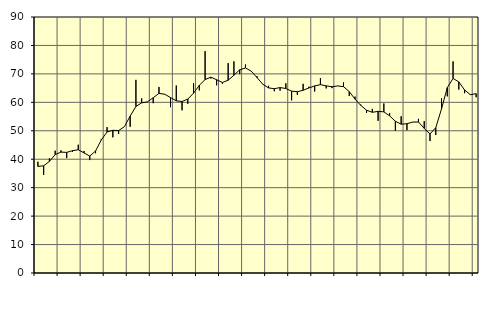
| Category | Piggar | Series 1 |
|---|---|---|
| nan | 39.1 | 37.46 |
| 1.0 | 34.5 | 37.68 |
| 1.0 | 40.3 | 39.23 |
| 1.0 | 43 | 41.63 |
| nan | 43.1 | 42.5 |
| 2.0 | 40.4 | 42.41 |
| 2.0 | 42.6 | 43 |
| 2.0 | 45.1 | 43.33 |
| nan | 42.9 | 42.22 |
| 3.0 | 39.7 | 41.11 |
| 3.0 | 42.1 | 42.87 |
| 3.0 | 47.1 | 46.78 |
| nan | 51.3 | 49.59 |
| 4.0 | 47.7 | 50.17 |
| 4.0 | 48.9 | 50.07 |
| 4.0 | 51.4 | 51.43 |
| nan | 51.4 | 55.16 |
| 5.0 | 67.9 | 58.56 |
| 5.0 | 61.4 | 59.81 |
| 5.0 | 60.1 | 60.16 |
| nan | 59.7 | 61.62 |
| 6.0 | 65.4 | 63.15 |
| 6.0 | 62.9 | 62.85 |
| 6.0 | 58.3 | 61.69 |
| nan | 65.9 | 60.53 |
| 7.0 | 57.2 | 60.29 |
| 7.0 | 59.5 | 61.15 |
| 7.0 | 66.7 | 63.23 |
| nan | 64.2 | 66.01 |
| 8.0 | 78 | 67.99 |
| 8.0 | 68.4 | 68.85 |
| 8.0 | 66 | 67.95 |
| nan | 66.5 | 66.98 |
| 9.0 | 73.8 | 67.78 |
| 9.0 | 74.4 | 69.53 |
| 9.0 | 69.9 | 71.44 |
| nan | 73.3 | 72.08 |
| 10.0 | 71 | 70.98 |
| 10.0 | 69.2 | 68.7 |
| 10.0 | 66.4 | 66.36 |
| nan | 65.8 | 65.08 |
| 11.0 | 63.9 | 64.79 |
| 11.0 | 64.1 | 65.19 |
| 11.0 | 66.7 | 64.86 |
| nan | 60.7 | 63.94 |
| 12.0 | 62.6 | 63.73 |
| 12.0 | 66.5 | 64.25 |
| 12.0 | 65.5 | 65.06 |
| nan | 63.8 | 65.77 |
| 13.0 | 68.5 | 66.22 |
| 13.0 | 64.9 | 65.8 |
| 13.0 | 65 | 65.48 |
| nan | 65.8 | 65.76 |
| 14.0 | 67 | 65.52 |
| 14.0 | 62.2 | 63.76 |
| 14.0 | 62 | 61.13 |
| nan | 59.2 | 58.93 |
| 15.0 | 56.3 | 57.22 |
| 15.0 | 57.7 | 56.5 |
| 15.0 | 53.5 | 56.83 |
| nan | 59.6 | 56.65 |
| 16.0 | 56.2 | 55.25 |
| 16.0 | 50 | 53.35 |
| 16.0 | 55.1 | 52.32 |
| nan | 50.2 | 52.48 |
| 17.0 | 53.1 | 53.06 |
| 17.0 | 54.2 | 53.08 |
| 17.0 | 53.4 | 50.84 |
| nan | 46.4 | 48.87 |
| 18.0 | 48.5 | 51.08 |
| 18.0 | 61.4 | 57.7 |
| 18.0 | 62.1 | 65.17 |
| nan | 74.4 | 68.4 |
| 19.0 | 64.5 | 67.2 |
| 19.0 | 63.2 | 64.34 |
| 19.0 | 62.8 | 62.69 |
| nan | 61.8 | 63.05 |